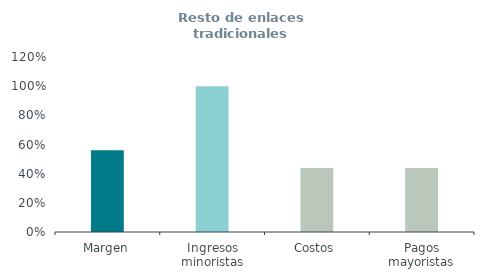
| Category | Resto de enlaces tradicionales
(% ingresos) |
|---|---|
| Margen | 0.561 |
| Ingresos minoristas | 1 |
| Costos | 0.439 |
| Pagos mayoristas | 0.439 |